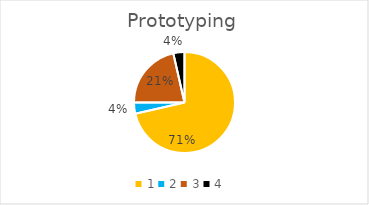
| Category | Series 0 |
|---|---|
| 0 | 0.714 |
| 1 | 0.036 |
| 2 | 0.214 |
| 3 | 0.036 |